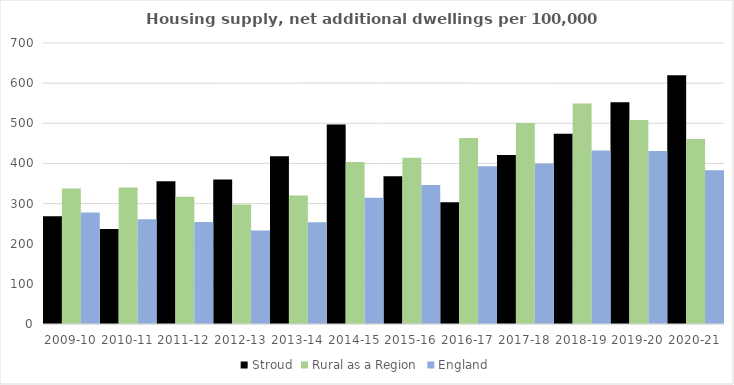
| Category | Stroud | Rural as a Region | England |
|---|---|---|---|
| 2009-10 | 268.567 | 337.852 | 277.548 |
| 2010-11 | 236.819 | 340.105 | 260.994 |
| 2011-12 | 355.519 | 317.04 | 254.007 |
| 2012-13 | 359.766 | 297.763 | 233.153 |
| 2013-14 | 418.076 | 319.835 | 253.602 |
| 2014-15 | 497.077 | 403.796 | 314.256 |
| 2015-16 | 368.233 | 414.091 | 346.154 |
| 2016-17 | 303.051 | 463.209 | 393.256 |
| 2017-18 | 420.723 | 500.68 | 399.646 |
| 2018-19 | 473.874 | 549.491 | 432.099 |
| 2019-20 | 552.666 | 508.493 | 431.187 |
| 2020-21 | 619.505 | 461.114 | 382.827 |